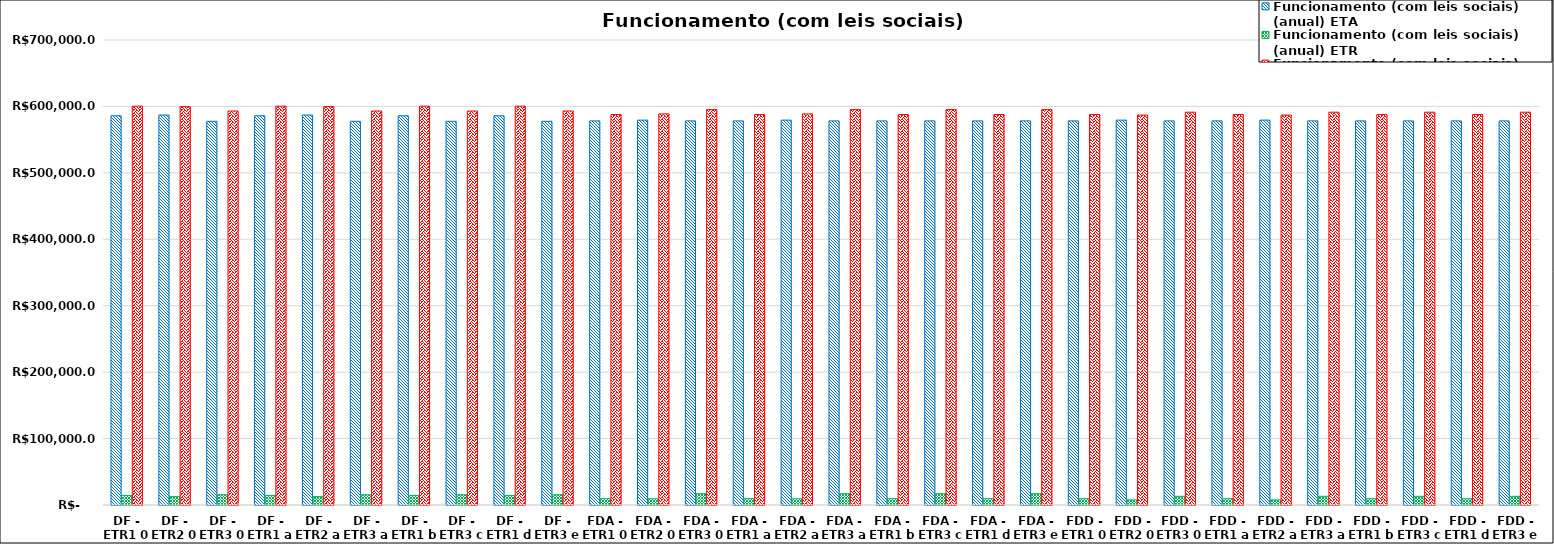
| Category | Funcionamento (com leis sociais) (anual) ETA | Funcionamento (com leis sociais) (anual) ETR | Funcionamento (com leis sociais) (anual) Total |
|---|---|---|---|
| DF - ETR1 0 | 585934.84 | 14448.717 | 600383.556 |
| DF - ETR2 0 | 587096.042 | 12588.016 | 599684.058 |
| DF - ETR3 0 | 577626.026 | 15445.363 | 593071.389 |
| DF - ETR1 a | 585934.84 | 14448.717 | 600383.556 |
| DF - ETR2 a | 587096.042 | 12588.016 | 599684.058 |
| DF - ETR3 a | 577626.026 | 15445.363 | 593071.389 |
| DF - ETR1 b | 585934.84 | 14448.717 | 600383.556 |
| DF - ETR3 c | 577626.026 | 15445.363 | 593071.389 |
| DF - ETR1 d | 585934.84 | 14448.717 | 600383.556 |
| DF - ETR3 e | 577626.026 | 15445.363 | 593071.389 |
| FDA - ETR1 0 | 578241.41 | 9510.668 | 587752.078 |
| FDA - ETR2 0 | 579402.626 | 9346.101 | 588748.727 |
| FDA - ETR3 0 | 578241.41 | 16999.2 | 595240.61 |
| FDA - ETR1 a | 578241.41 | 9510.668 | 587752.078 |
| FDA - ETR2 a | 579402.626 | 9346.101 | 588748.727 |
| FDA - ETR3 a | 578241.41 | 16999.2 | 595240.61 |
| FDA - ETR1 b | 578241.41 | 9510.668 | 587752.078 |
| FDA - ETR3 c | 578241.41 | 16999.2 | 595240.61 |
| FDA - ETR1 d | 578241.41 | 9510.668 | 587752.078 |
| FDA - ETR3 e | 578241.41 | 16999.2 | 595240.61 |
| FDD - ETR1 0 | 578241.377 | 9476.6 | 587717.977 |
| FDD - ETR2 0 | 579402.593 | 7615.899 | 587018.492 |
| FDD - ETR3 0 | 578241.377 | 13086.36 | 591327.737 |
| FDD - ETR1 a | 578241.377 | 9476.6 | 587717.977 |
| FDD - ETR2 a | 579402.593 | 7615.899 | 587018.492 |
| FDD - ETR3 a | 578241.377 | 13086.36 | 591327.737 |
| FDD - ETR1 b | 578241.377 | 9476.6 | 587717.977 |
| FDD - ETR3 c | 578241.377 | 13086.36 | 591327.737 |
| FDD - ETR1 d | 578241.377 | 9476.6 | 587717.977 |
| FDD - ETR3 e | 578241.377 | 13086.36 | 591327.737 |